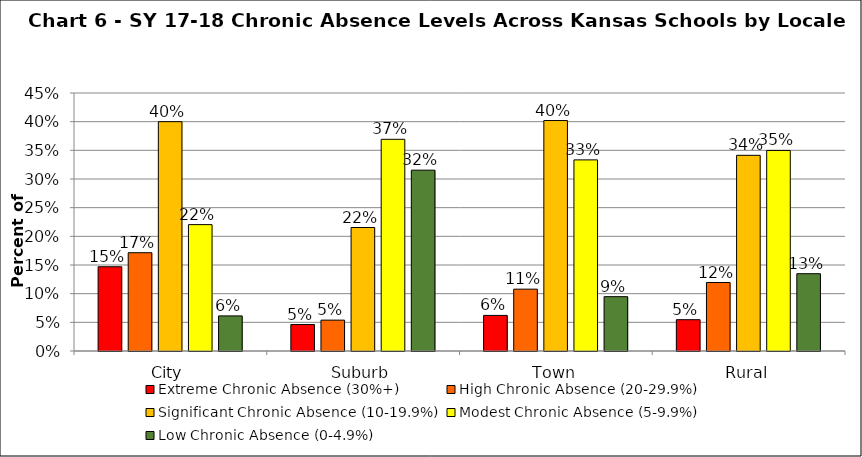
| Category | Extreme Chronic Absence (30%+) | High Chronic Absence (20-29.9%) | Significant Chronic Absence (10-19.9%) | Modest Chronic Absence (5-9.9%) | Low Chronic Absence (0-4.9%) |
|---|---|---|---|---|---|
| 0 | 0.147 | 0.171 | 0.4 | 0.22 | 0.061 |
| 1 | 0.046 | 0.054 | 0.215 | 0.369 | 0.315 |
| 2 | 0.062 | 0.108 | 0.402 | 0.333 | 0.095 |
| 3 | 0.055 | 0.119 | 0.341 | 0.35 | 0.135 |